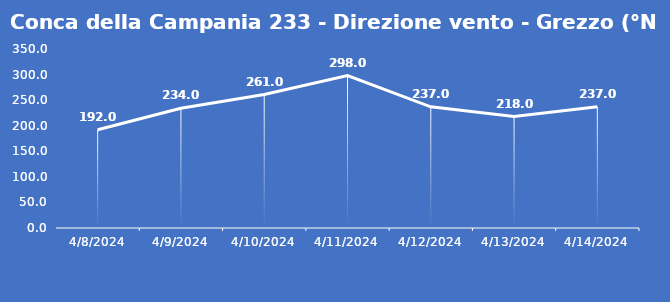
| Category | Conca della Campania 233 - Direzione vento - Grezzo (°N) |
|---|---|
| 4/8/24 | 192 |
| 4/9/24 | 234 |
| 4/10/24 | 261 |
| 4/11/24 | 298 |
| 4/12/24 | 237 |
| 4/13/24 | 218 |
| 4/14/24 | 237 |